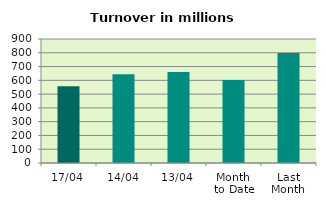
| Category | Series 0 |
|---|---|
| 17/04 | 557.132 |
| 14/04 | 644.238 |
| 13/04 | 660.456 |
| Month 
to Date | 603.177 |
| Last
Month | 798.115 |